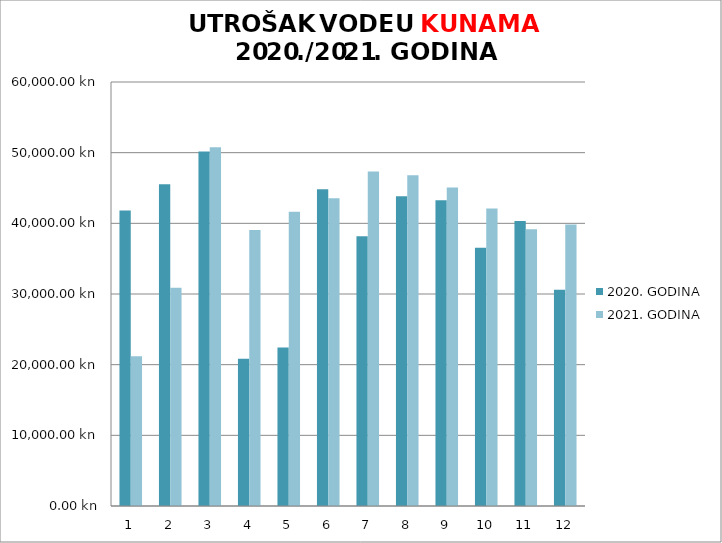
| Category | 2020. GODINA | 2021. GODINA |
|---|---|---|
| 0 | 41811.54 | 21202 |
| 1 | 45543.99 | 30879.58 |
| 2 | 50172.1 | 50768.82 |
| 3 | 20849.1 | 39068.71 |
| 4 | 22429.62 | 41650.66 |
| 5 | 44814.74 | 43554.25 |
| 6 | 38155.01 | 47339.18 |
| 7 | 43824.53 | 46817.54 |
| 8 | 43254.71 | 45086.61 |
| 9 | 36528.7 | 42088.32 |
| 10 | 40346.08 | 39147.07 |
| 11 | 30613.46 | 39827.63 |